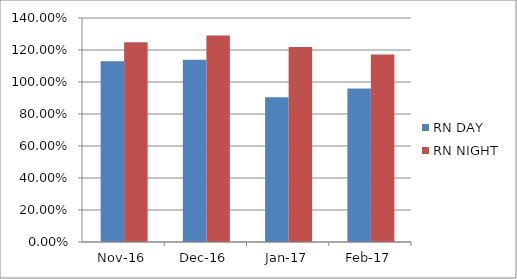
| Category | RN DAY | RN NIGHT |
|---|---|---|
| 2016-11-01 | 1.13 | 1.248 |
| 2016-12-01 | 1.139 | 1.29 |
| 2017-01-01 | 0.905 | 1.218 |
| 2017-02-01 | 0.96 | 1.173 |